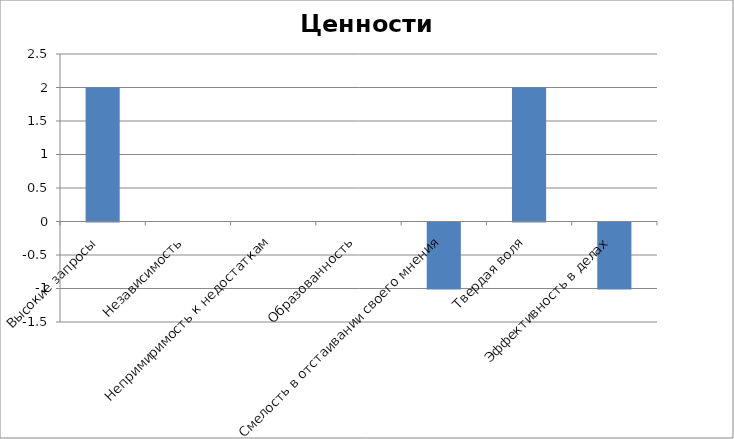
| Category | Ценности самоутверждения |
|---|---|
| Высокие запросы | 2 |
| Независимость | 0 |
| Непримиримость к недостаткам | 0 |
| Образованность | 0 |
| Смелость в отстаивании своего мнения | -1 |
| Твердая воля | 2 |
| Эффективность в делах | -1 |